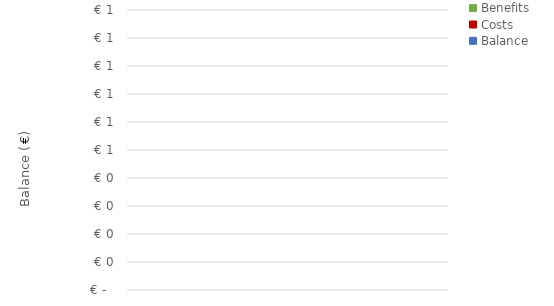
| Category | Benefits | Costs | Balance |
|---|---|---|---|
| 0.0 | 0 | 0 | 0 |